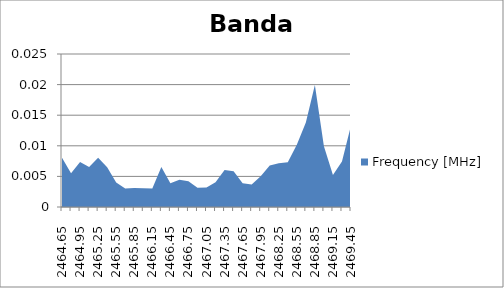
| Category | Frequency [MHz] |
|---|---|
| 2464.65 | 0.008 |
| 2464.8 | 0.006 |
| 2464.95 | 0.007 |
| 2465.1 | 0.007 |
| 2465.25 | 0.008 |
| 2465.4 | 0.007 |
| 2465.55 | 0.004 |
| 2465.7 | 0.003 |
| 2465.85 | 0.003 |
| 2466.0 | 0.003 |
| 2466.15 | 0.003 |
| 2466.3 | 0.007 |
| 2466.45 | 0.004 |
| 2466.6 | 0.004 |
| 2466.75 | 0.004 |
| 2466.9 | 0.003 |
| 2467.05 | 0.003 |
| 2467.2 | 0.004 |
| 2467.35 | 0.006 |
| 2467.5 | 0.006 |
| 2467.65 | 0.004 |
| 2467.8 | 0.004 |
| 2467.95 | 0.005 |
| 2468.1 | 0.007 |
| 2468.25 | 0.007 |
| 2468.4 | 0.007 |
| 2468.55 | 0.01 |
| 2468.7 | 0.014 |
| 2468.85 | 0.02 |
| 2469.0 | 0.01 |
| 2469.15 | 0.005 |
| 2469.3 | 0.007 |
| 2469.45 | 0.013 |